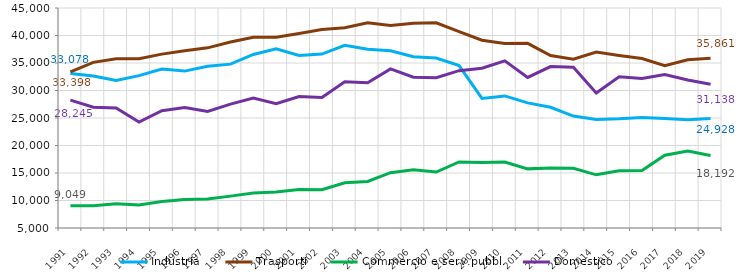
| Category | Industria | Trasporti | Commercio e serv.pubbl. | Domestico |
|---|---|---|---|---|
| 1991 | 33077.988 | 33397.674 | 9048.698 | 28245.244 |
| 1992 | 32648.999 | 35119.647 | 9031.936 | 26944.544 |
| 1993 | 31804.137 | 35790.484 | 9405.491 | 26801.449 |
| 1994 | 32710.749 | 35776.094 | 9179.306 | 24261.338 |
| 1995 | 33887.513 | 36615.441 | 9816.717 | 26323.974 |
| 1996 | 33525.986 | 37229.6 | 10198.039 | 26913.124 |
| 1997 | 34410.384 | 37753.236 | 10259.793 | 26187.613 |
| 1998 | 34793.768 | 38807.173 | 10794.385 | 27513.968 |
| 1999 | 36551.311 | 39682.273 | 11363.371 | 28622.413 |
| 2000 | 37585.368 | 39691.975 | 11542.185 | 27591.928 |
| 2001 | 36376.509 | 40361.042 | 11993.491 | 28907.182 |
| 2002 | 36622.733 | 41082.495 | 11955.65 | 28741.609 |
| 2003 | 38225.619 | 41411.448 | 13218.049 | 31590.238 |
| 2004 | 37509.213 | 42309.926 | 13469.065 | 31425.185 |
| 2005 | 37211.521 | 41838.889 | 15053.318 | 33921.569 |
| 2006 | 36144.577 | 42216.674 | 15568.845 | 32423.683 |
| 2007 | 35907.652 | 42314.794 | 15181.676 | 32339.575 |
| 2008 | 34528.295 | 40707.409 | 17019.079 | 33611.748 |
| 2009 | 28552.887 | 39131.363 | 16919.464 | 34040.636 |
| 2010 | 29014.718 | 38566.288 | 16978.719 | 35392.911 |
| 2011 | 27744.858 | 38572.097 | 15751.376 | 32378.063 |
| 2012 | 26948.704 | 36348.734 | 15930.534 | 34348.336 |
| 2013 | 25353.587 | 35701.272 | 15846.527 | 34230.62 |
| 2014 | 24739.085 | 37009.372 | 14666.679 | 29545.98 |
| 2015 | 24853.372 | 36374.374 | 15391.466 | 32494.483 |
| 2016 | 25088.949 | 35814.501 | 15439.966 | 32185.101 |
| 2017 | 24925.749 | 34525.408 | 18242.166 | 32898.639 |
| 2018 | 24663.854 | 35579.484 | 19002.194 | 31905.559 |
| 2019 | 24928.486 | 35861.202 | 18192.3 | 31138.335 |